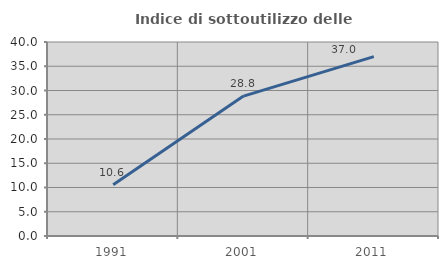
| Category | Indice di sottoutilizzo delle abitazioni  |
|---|---|
| 1991.0 | 10.59 |
| 2001.0 | 28.846 |
| 2011.0 | 36.977 |